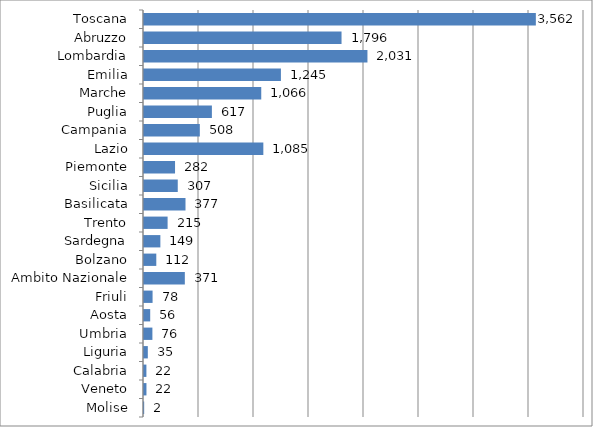
| Category | Series 0 |
|---|---|
| Toscana | 3562.212 |
| Abruzzo | 1795.795 |
| Lombardia | 2031.353 |
| Emilia | 1244.681 |
| Marche | 1065.959 |
| Puglia | 617.17 |
| Campania | 507.518 |
| Lazio | 1084.927 |
| Piemonte | 282.157 |
| Sicilia | 306.899 |
| Basilicata | 377.256 |
| Trento | 214.552 |
| Sardegna | 148.789 |
| Bolzano | 111.766 |
| Ambito Nazionale | 371.218 |
| Friuli | 77.934 |
| Aosta | 56.365 |
| Umbria | 76.341 |
| Liguria | 34.751 |
| Calabria | 21.856 |
| Veneto | 22.297 |
| Molise | 1.54 |